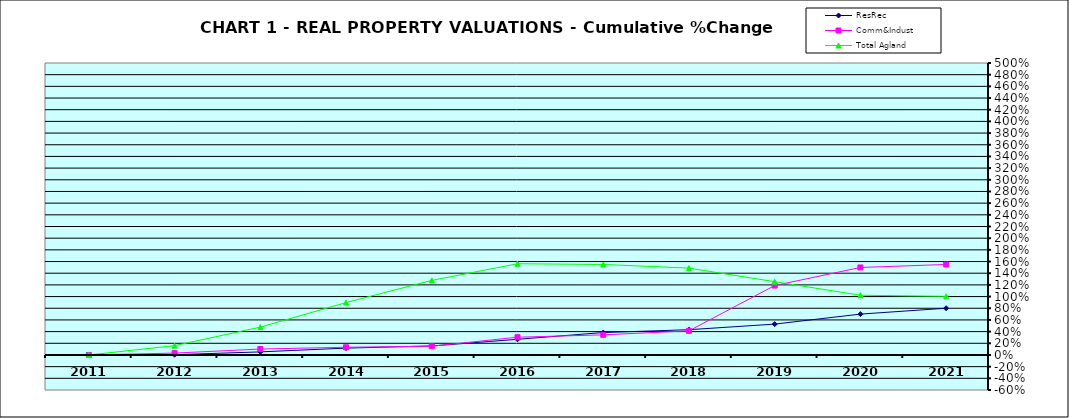
| Category | ResRec | Comm&Indust | Total Agland |
|---|---|---|---|
| 2011.0 | 0 | 0 | 0 |
| 2012.0 | 0.004 | 0.032 | 0.159 |
| 2013.0 | 0.053 | 0.101 | 0.477 |
| 2014.0 | 0.117 | 0.132 | 0.897 |
| 2015.0 | 0.155 | 0.15 | 1.277 |
| 2016.0 | 0.268 | 0.304 | 1.562 |
| 2017.0 | 0.384 | 0.345 | 1.55 |
| 2018.0 | 0.433 | 0.413 | 1.487 |
| 2019.0 | 0.528 | 1.189 | 1.255 |
| 2020.0 | 0.7 | 1.498 | 1.023 |
| 2021.0 | 0.8 | 1.55 | 1.004 |